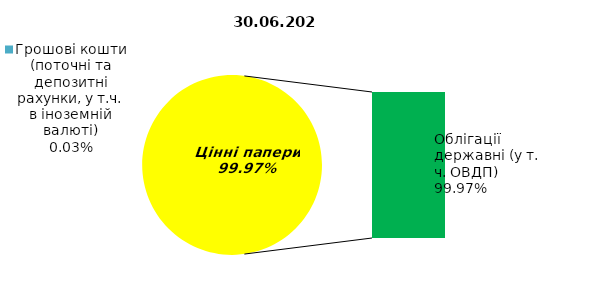
| Category | Series 0 |
|---|---|
| Грошові кошти (поточні та депозитні рахунки, у т.ч. в іноземній валюті) | 0.044 |
| Банківські метали | 0 |
| Нерухомість | 0 |
| Інші активи | 0 |
| Акції | 0 |
| Корпоративні облігації  | 0 |
| Облігації місцевих позик | 0 |
| Облігації державні (у т. ч. ОВДП) | 176.191 |
| Іпотечні сертифікати | 0 |